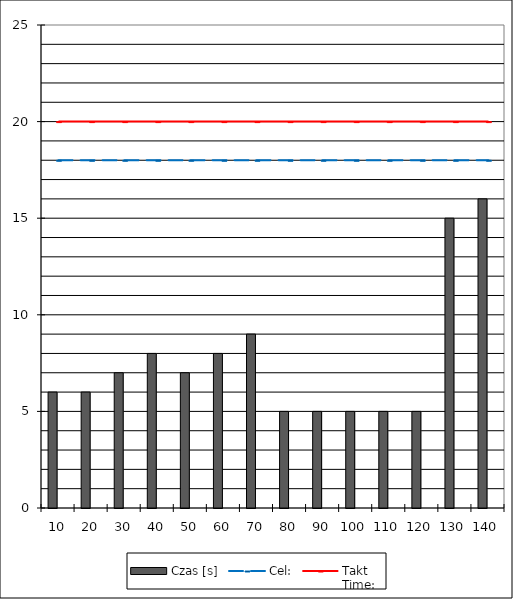
| Category | Czas [s] | Tolerancja: |
|---|---|---|
| 10.0 | 6 | 0.9 |
| 20.0 | 6 | 0.9 |
| 30.0 | 7 | 0.9 |
| 40.0 | 8 | 0.9 |
| 50.0 | 7 | 0.9 |
| 60.0 | 8 | 0.9 |
| 70.0 | 9 | 0.9 |
| 80.0 | 5 | 0.9 |
| 90.0 | 5 | 0.9 |
| 100.0 | 5 | 0.9 |
| 110.0 | 5 | 0.9 |
| 120.0 | 5 | 0.9 |
| 130.0 | 15 | 0.9 |
| 140.0 | 16 | 0.9 |